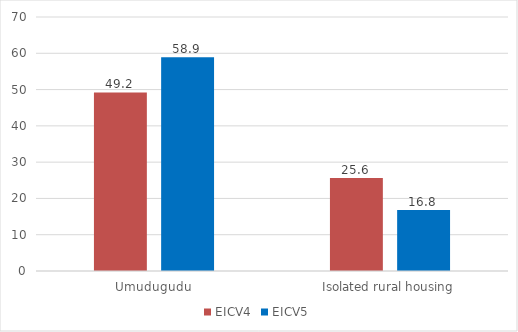
| Category | EICV4 | EICV5 |
|---|---|---|
| Umudugudu | 49.2 | 58.9 |
| Isolated rural housing | 25.6 | 16.8 |